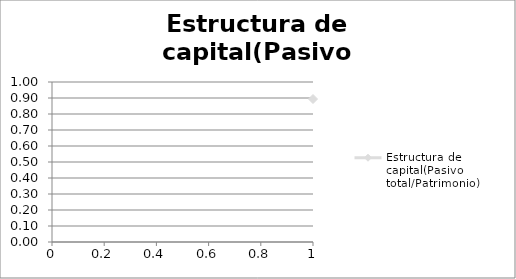
| Category | Estructura de capital(Pasivo total/Patrimonio) |
|---|---|
| 0 | 0.894 |
| 1 | 0.505 |
| 2 | 0.368 |
| 3 | 0.254 |
| 4 | 0.184 |
| 5 | 0.136 |
| 6 | 0.1 |
| 7 | 0.072 |